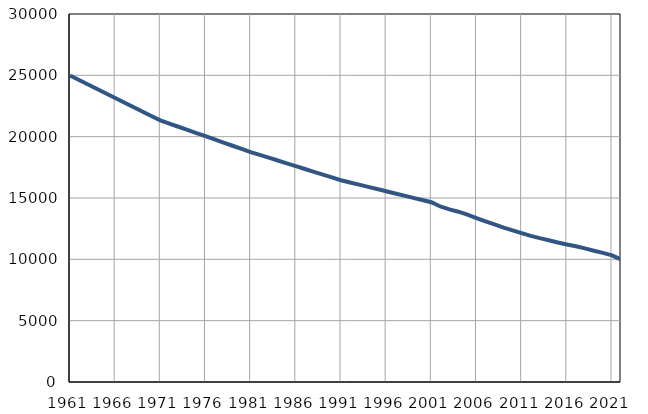
| Category | Population
size |
|---|---|
| 1961.0 | 24982 |
| 1962.0 | 24616 |
| 1963.0 | 24252 |
| 1964.0 | 23885 |
| 1965.0 | 23519 |
| 1966.0 | 23154 |
| 1967.0 | 22788 |
| 1968.0 | 22422 |
| 1969.0 | 22055 |
| 1970.0 | 21691 |
| 1971.0 | 21325 |
| 1972.0 | 21067 |
| 1973.0 | 20809 |
| 1974.0 | 20551 |
| 1975.0 | 20293 |
| 1976.0 | 20035 |
| 1977.0 | 19776 |
| 1978.0 | 19518 |
| 1979.0 | 19260 |
| 1980.0 | 19002 |
| 1981.0 | 18744 |
| 1982.0 | 18514 |
| 1983.0 | 18285 |
| 1984.0 | 18055 |
| 1985.0 | 17825 |
| 1986.0 | 17596 |
| 1987.0 | 17366 |
| 1988.0 | 17136 |
| 1989.0 | 16906 |
| 1990.0 | 16677 |
| 1991.0 | 16447 |
| 1992.0 | 16268 |
| 1993.0 | 16088 |
| 1994.0 | 15909 |
| 1995.0 | 15730 |
| 1996.0 | 15551 |
| 1997.0 | 15371 |
| 1998.0 | 15192 |
| 1999.0 | 15013 |
| 2000.0 | 14834 |
| 2001.0 | 14654 |
| 2002.0 | 14312 |
| 2003.0 | 14073 |
| 2004.0 | 13882 |
| 2005.0 | 13645 |
| 2006.0 | 13369 |
| 2007.0 | 13101 |
| 2008.0 | 12845 |
| 2009.0 | 12593 |
| 2010.0 | 12358 |
| 2011.0 | 12132 |
| 2012.0 | 11909 |
| 2013.0 | 11725 |
| 2014.0 | 11559 |
| 2015.0 | 11377 |
| 2016.0 | 11214 |
| 2017.0 | 11065 |
| 2018.0 | 10889 |
| 2019.0 | 10702 |
| 2020.0 | 10523 |
| 2021.0 | 10325 |
| 2022.0 | 9993 |